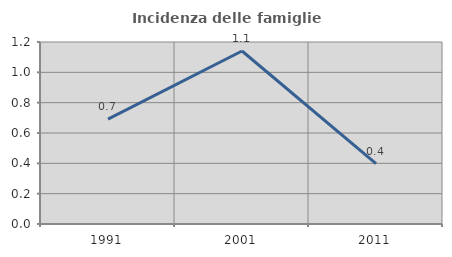
| Category | Incidenza delle famiglie numerose |
|---|---|
| 1991.0 | 0.692 |
| 2001.0 | 1.141 |
| 2011.0 | 0.398 |